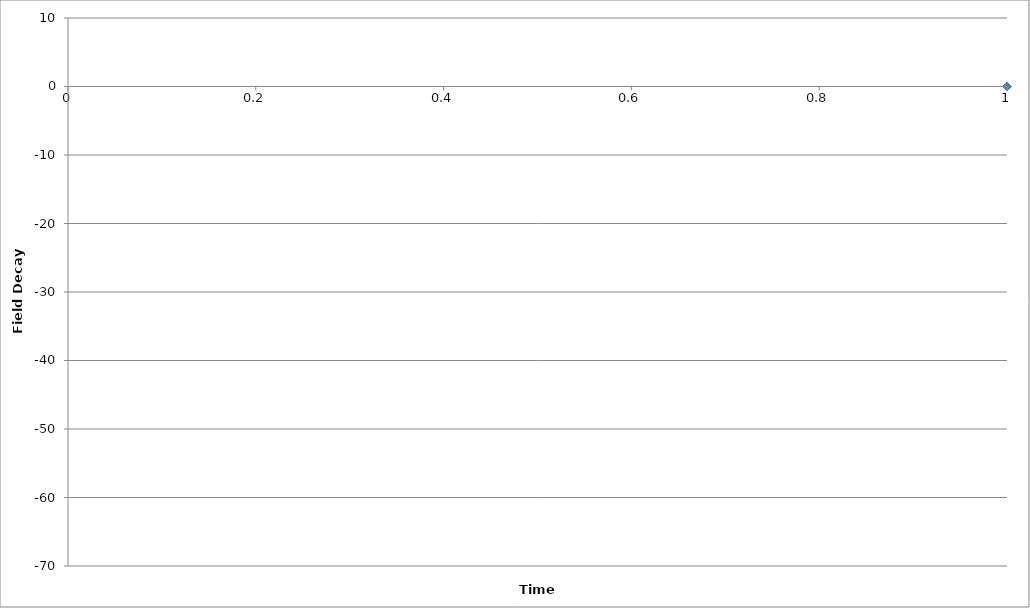
| Category | Series 0 |
|---|---|
| 0 | 0 |
| 1 | 3.044 |
| 2 | -2.489 |
| 3 | -3.911 |
| 4 | -5.2 |
| 5 | -6.4 |
| 6 | -7.422 |
| 7 | -8.467 |
| 8 | -9.733 |
| 9 | -10.689 |
| 10 | -11.889 |
| 11 | -12.933 |
| 12 | -14.022 |
| 13 | -15.044 |
| 14 | -15.956 |
| 15 | -16.778 |
| 16 | -17.889 |
| 17 | -18.822 |
| 18 | -19.644 |
| 19 | -20.689 |
| 20 | -21.622 |
| 21 | -22.778 |
| 22 | -24.133 |
| 23 | -25.156 |
| 24 | -26.822 |
| 25 | -28.511 |
| 26 | -30.089 |
| 27 | -31.889 |
| 28 | -34.2 |
| 29 | -36.067 |
| 30 | -37.911 |
| 31 | -39.667 |
| 32 | -41.222 |
| 33 | -42.178 |
| 34 | -43.467 |
| 35 | -44.311 |
| 36 | -44.978 |
| 37 | -45.689 |
| 38 | -46.267 |
| 39 | -46.578 |
| 40 | -47.222 |
| 41 | -47.756 |
| 42 | -48.044 |
| 43 | -48.467 |
| 44 | -49.289 |
| 45 | -49.978 |
| 46 | -50.8 |
| 47 | -51.756 |
| 48 | -52.556 |
| 49 | -53.689 |
| 50 | -55.156 |
| 51 | -56.222 |
| 52 | -57.356 |
| 53 | -58.356 |
| 54 | -59.067 |
| 55 | -59.844 |
| 56 | -60.467 |
| 57 | -61.044 |
| 58 | -61.444 |
| 59 | -62.044 |
| 60 | -62.556 |
| 61 | -63.267 |
| 62 | -63.6 |
| 63 | -64.222 |
| 64 | -64.356 |
| 65 | -64.733 |
| 66 | -65.156 |
| 67 | -65.511 |